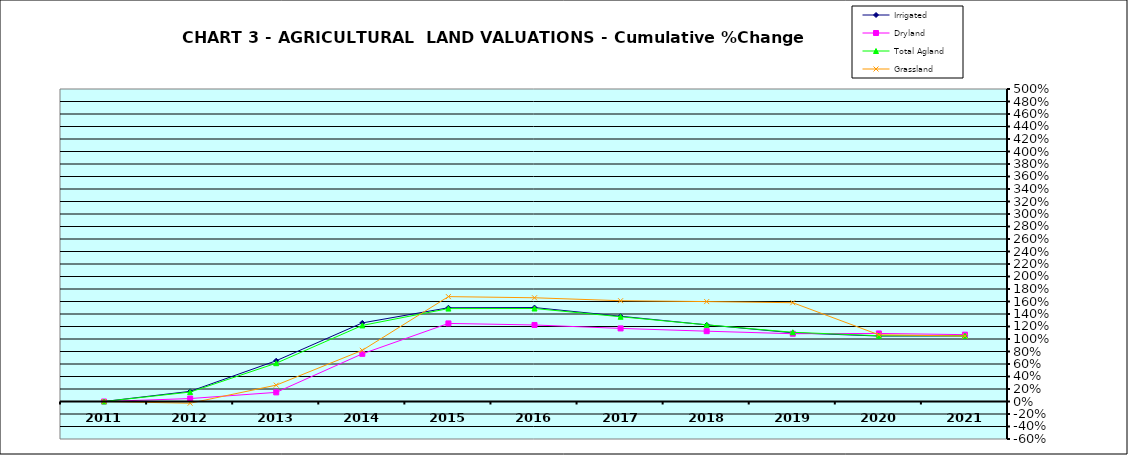
| Category | Irrigated | Dryland | Total Agland | Grassland |
|---|---|---|---|---|
| 2011.0 | 0 | 0 | 0 | 0 |
| 2012.0 | 0.162 | 0.047 | 0.151 | -0.027 |
| 2013.0 | 0.652 | 0.146 | 0.613 | 0.262 |
| 2014.0 | 1.258 | 0.763 | 1.217 | 0.819 |
| 2015.0 | 1.5 | 1.249 | 1.487 | 1.678 |
| 2016.0 | 1.503 | 1.224 | 1.488 | 1.66 |
| 2017.0 | 1.364 | 1.169 | 1.356 | 1.613 |
| 2018.0 | 1.226 | 1.125 | 1.227 | 1.599 |
| 2019.0 | 1.099 | 1.084 | 1.108 | 1.581 |
| 2020.0 | 1.047 | 1.089 | 1.052 | 1.067 |
| 2021.0 | 1.049 | 1.07 | 1.052 | 1.048 |